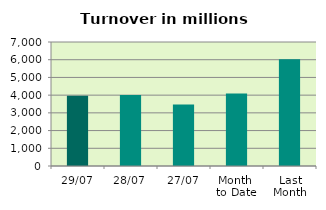
| Category | Series 0 |
|---|---|
| 29/07 | 3958.875 |
| 28/07 | 4009.785 |
| 27/07 | 3477.854 |
| Month 
to Date | 4089.802 |
| Last
Month | 6026.772 |